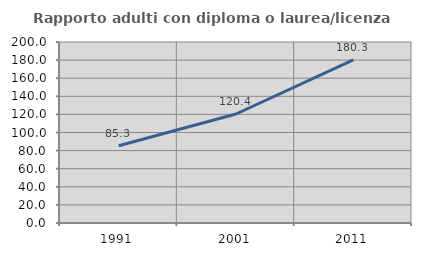
| Category | Rapporto adulti con diploma o laurea/licenza media  |
|---|---|
| 1991.0 | 85.3 |
| 2001.0 | 120.431 |
| 2011.0 | 180.265 |